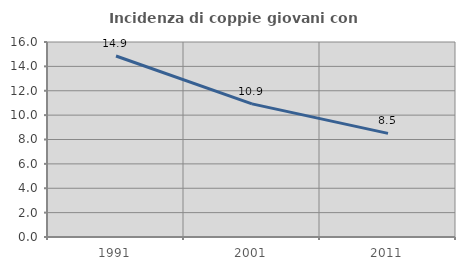
| Category | Incidenza di coppie giovani con figli |
|---|---|
| 1991.0 | 14.85 |
| 2001.0 | 10.921 |
| 2011.0 | 8.501 |